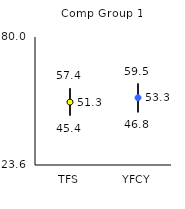
| Category | 25th | 75th | Mean |
|---|---|---|---|
| TFS | 45.4 | 57.4 | 51.31 |
| YFCY | 46.8 | 59.5 | 53.26 |